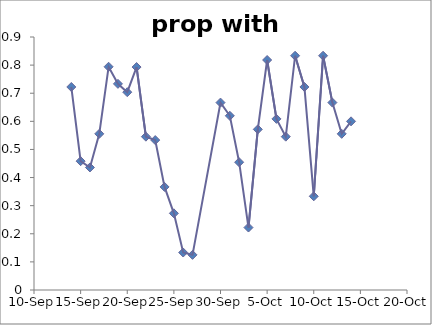
| Category | prop with sacs |
|---|---|
| 38244.0 | 0.722 |
| 38245.0 | 0.458 |
| 38246.0 | 0.436 |
| 38247.0 | 0.556 |
| 38248.0 | 0.794 |
| 38249.0 | 0.733 |
| 38250.0 | 0.704 |
| 38251.0 | 0.793 |
| 38252.0 | 0.545 |
| 38253.0 | 0.533 |
| 38254.0 | 0.367 |
| 38255.0 | 0.273 |
| 38256.0 | 0.133 |
| 38257.0 | 0.125 |
| 38260.0 | 0.667 |
| 38261.0 | 0.62 |
| 38262.0 | 0.455 |
| 38263.0 | 0.222 |
| 38264.0 | 0.571 |
| 38265.0 | 0.818 |
| 38266.0 | 0.609 |
| 38267.0 | 0.545 |
| 38268.0 | 0.833 |
| 38269.0 | 0.722 |
| 38270.0 | 0.333 |
| 38271.0 | 0.833 |
| 38272.0 | 0.667 |
| 38273.0 | 0.556 |
| 38274.0 | 0.6 |